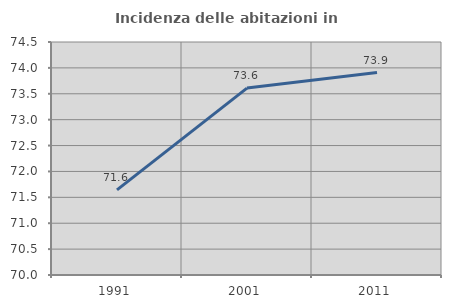
| Category | Incidenza delle abitazioni in proprietà  |
|---|---|
| 1991.0 | 71.644 |
| 2001.0 | 73.61 |
| 2011.0 | 73.91 |